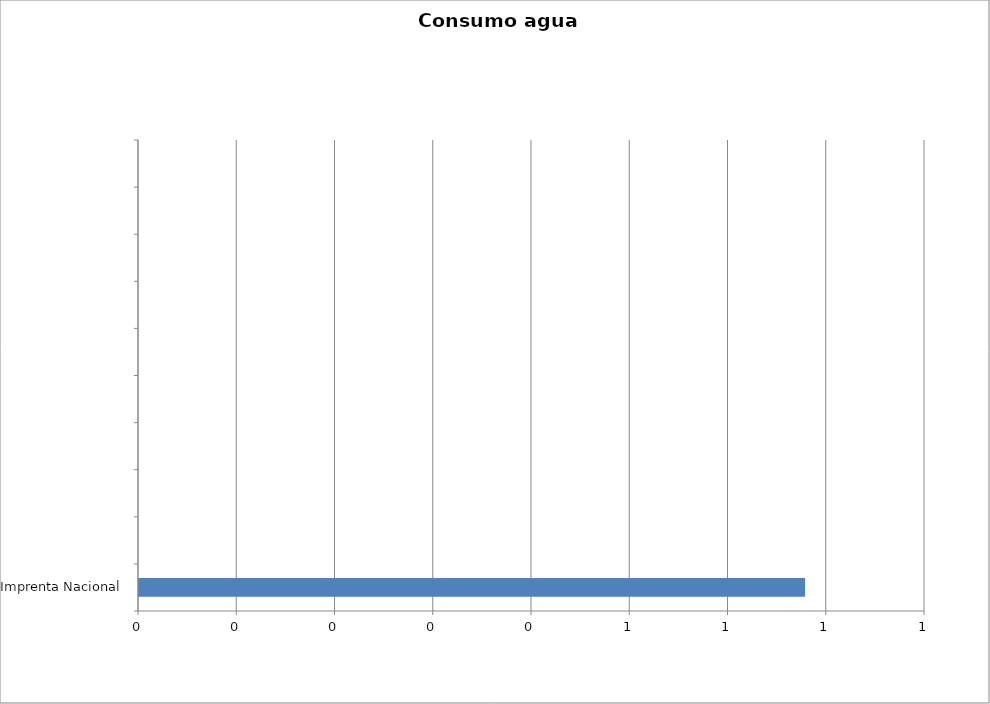
| Category | Series 0 |
|---|---|
| Imprenta Nacional | 0.678 |